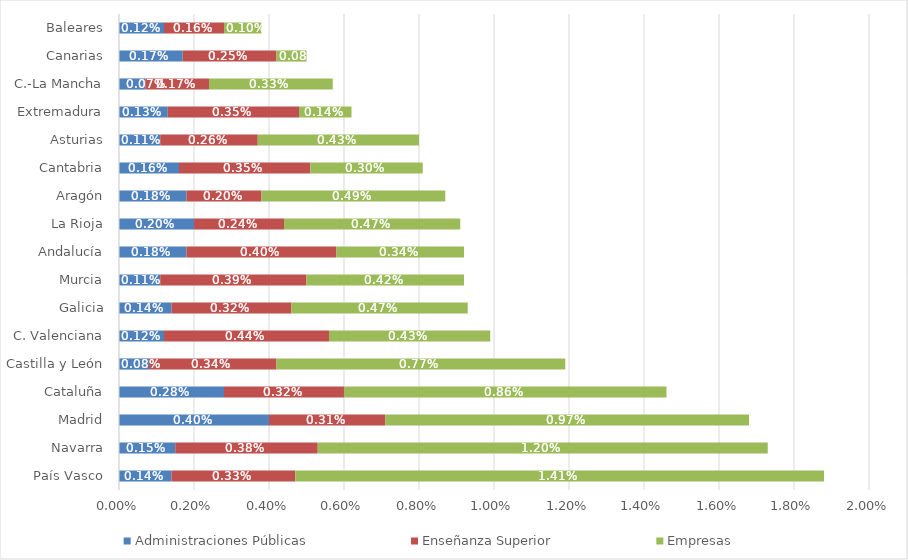
| Category | Administraciones Públicas | Enseñanza Superior | Empresas |
|---|---|---|---|
| País Vasco | 0.001 | 0.003 | 0.014 |
| Navarra | 0.002 | 0.004 | 0.012 |
| Madrid | 0.004 | 0.003 | 0.01 |
| Cataluña | 0.003 | 0.003 | 0.009 |
| Castilla y León | 0.001 | 0.003 | 0.008 |
| C. Valenciana | 0.001 | 0.004 | 0.004 |
| Galicia | 0.001 | 0.003 | 0.005 |
| Murcia | 0.001 | 0.004 | 0.004 |
| Andalucía | 0.002 | 0.004 | 0.003 |
| La Rioja | 0.002 | 0.002 | 0.005 |
| Aragón | 0.002 | 0.002 | 0.005 |
| Cantabria | 0.002 | 0.004 | 0.003 |
| Asturias | 0.001 | 0.003 | 0.004 |
| Extremadura | 0.001 | 0.004 | 0.001 |
| C.-La Mancha | 0.001 | 0.002 | 0.003 |
| Canarias | 0.002 | 0.002 | 0.001 |
| Baleares | 0.001 | 0.002 | 0.001 |